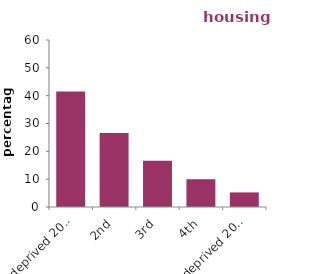
| Category | housing association |
|---|---|
| most deprived 20% | 41.52 |
| 2nd | 26.599 |
| 3rd | 16.653 |
| 4th | 9.983 |
| least deprived 20% | 5.245 |